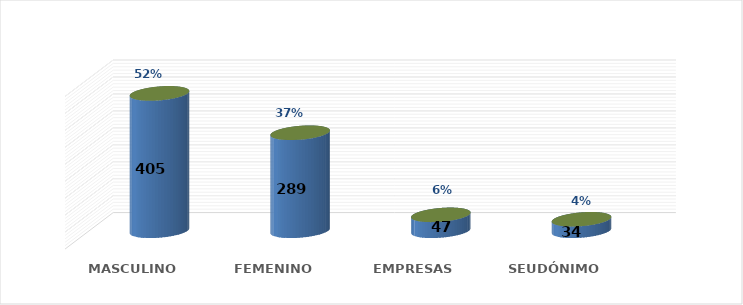
| Category | SOLICITUD POR GÉNERO | Series 1 |
|---|---|---|
| MASCULINO | 405 | 0.523 |
| FEMENINO | 289 | 0.373 |
| EMPRESAS | 47 | 0.061 |
| SEUDÓNIMO | 34 | 0.044 |